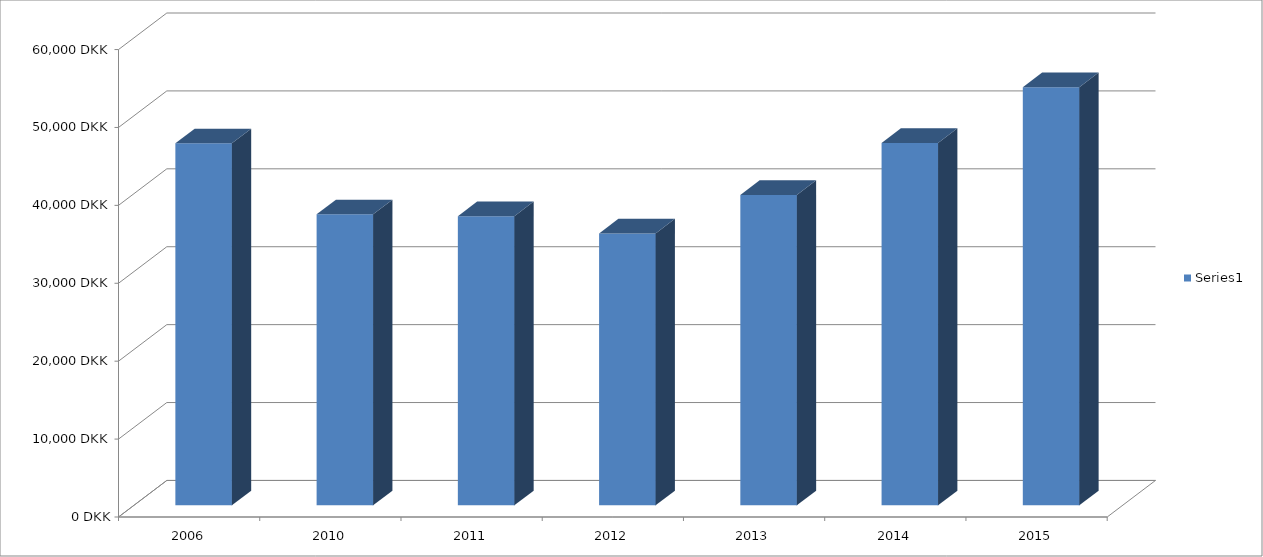
| Category | Series 0 |
|---|---|
| 2006.0 | 46459 |
| 2010.0 | 37344 |
| 2011.0 | 37114 |
| 2012.0 | 34902 |
| 2013.0 | 39834 |
| 2014.0 | 46512 |
| 2015.0 | 53664 |